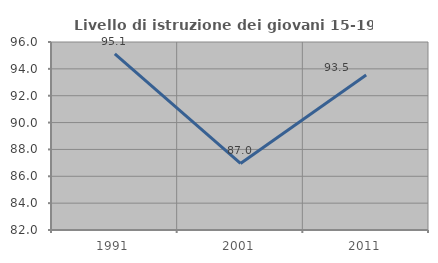
| Category | Livello di istruzione dei giovani 15-19 anni |
|---|---|
| 1991.0 | 95.122 |
| 2001.0 | 86.957 |
| 2011.0 | 93.548 |